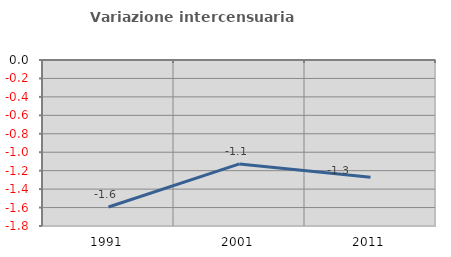
| Category | Variazione intercensuaria annua |
|---|---|
| 1991.0 | -1.594 |
| 2001.0 | -1.127 |
| 2011.0 | -1.27 |